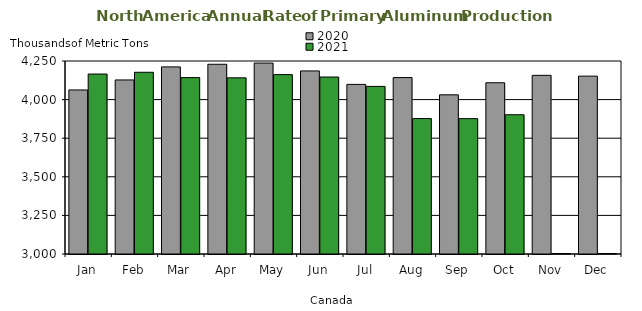
| Category | 2020 | 2021 |
|---|---|---|
| Jan | 4062.482 | 4165.415 |
| Feb | 4127.332 | 4177.021 |
| Mar | 4211.869 | 4142.373 |
| Apr | 4228.923 | 4140.901 |
| May | 4236.792 | 4161.765 |
| Jun | 4185.686 | 4146.23 |
| Jul | 4098.562 | 4085.539 |
| Aug | 4142.541 | 3877.277 |
| Sep | 4030.953 | 3876.75 |
| Oct | 4109.212 | 3901.897 |
| Nov | 4157.113 | 0 |
| Dec | 4151.987 | 0 |